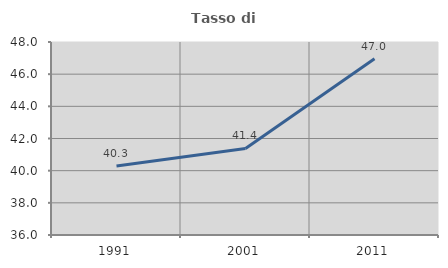
| Category | Tasso di occupazione   |
|---|---|
| 1991.0 | 40.288 |
| 2001.0 | 41.384 |
| 2011.0 | 46.961 |